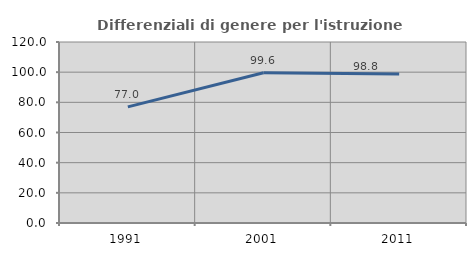
| Category | Differenziali di genere per l'istruzione superiore |
|---|---|
| 1991.0 | 76.981 |
| 2001.0 | 99.574 |
| 2011.0 | 98.818 |